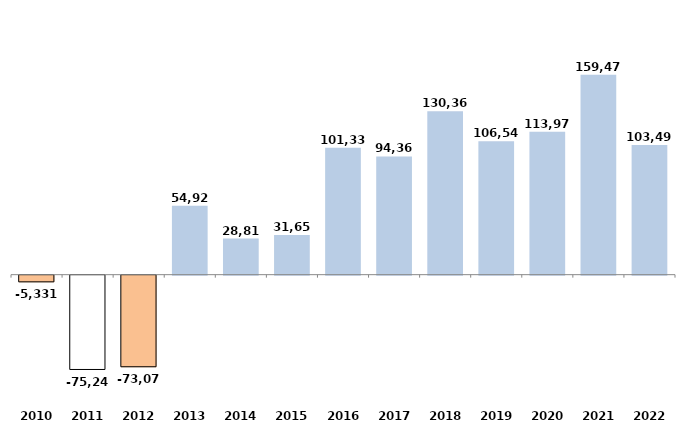
| Category | Series 0 |
|---|---|
| 2010 | -5330.58 |
| 2011 | -75249.08 |
| 2012 | -73076.52 |
| 2013 | 54927.14 |
| 2014 | 28816.78 |
| 2015 | 31651.52 |
| 2016 | 101335.21 |
| 2017 | 94367.58 |
| 2018 | 130360.01 |
| 2019 | 106541.18 |
| 2020 | 113975 |
| 2021 | 159478 |
| 2022 | 103498.991 |